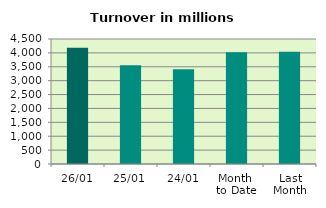
| Category | Series 0 |
|---|---|
| 26/01 | 4189.458 |
| 25/01 | 3558.917 |
| 24/01 | 3409.423 |
| Month 
to Date | 4023.945 |
| Last
Month | 4039.067 |